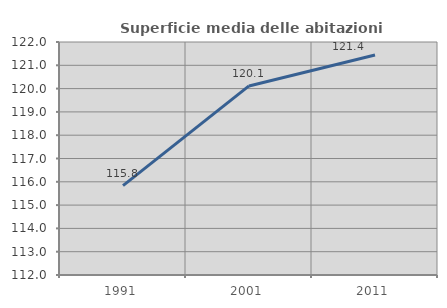
| Category | Superficie media delle abitazioni occupate |
|---|---|
| 1991.0 | 115.834 |
| 2001.0 | 120.115 |
| 2011.0 | 121.445 |